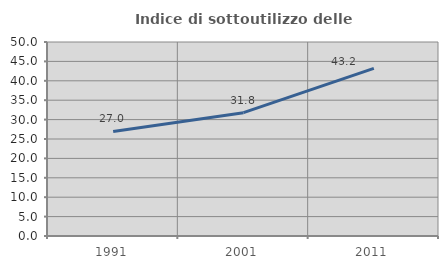
| Category | Indice di sottoutilizzo delle abitazioni  |
|---|---|
| 1991.0 | 26.957 |
| 2001.0 | 31.783 |
| 2011.0 | 43.22 |